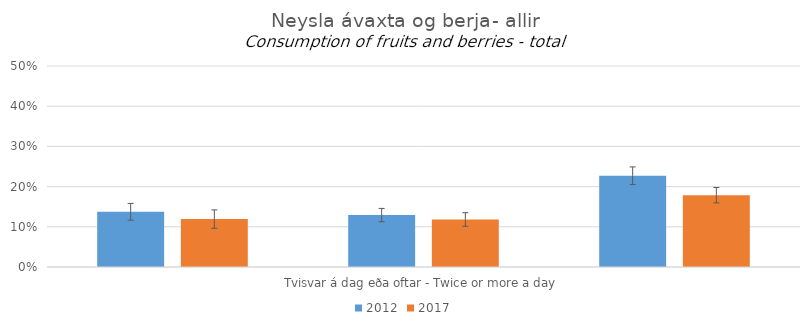
| Category | 2012 | 2017 |
|---|---|---|
| 0 | 0.137 | 0.119 |
| 1 | 0.129 | 0.118 |
| 2 | 0.227 | 0.179 |